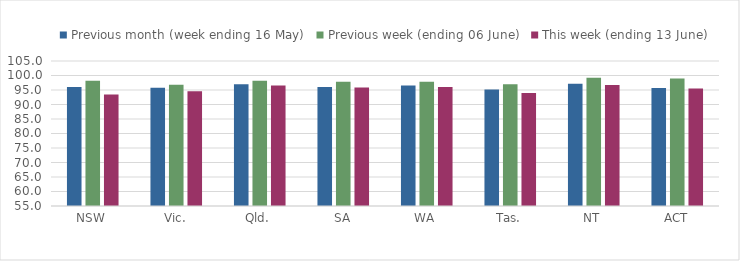
| Category | Previous month (week ending 16 May) | Previous week (ending 06 June) | This week (ending 13 June) |
|---|---|---|---|
| NSW | 96.076 | 98.202 | 93.468 |
| Vic. | 95.786 | 96.787 | 94.571 |
| Qld. | 96.942 | 98.194 | 96.59 |
| SA | 96.075 | 97.855 | 95.902 |
| WA | 96.574 | 97.824 | 96.015 |
| Tas. | 95.146 | 96.996 | 93.985 |
| NT | 97.156 | 99.243 | 96.703 |
| ACT | 95.729 | 98.999 | 95.516 |